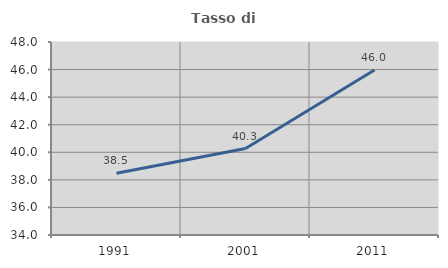
| Category | Tasso di occupazione   |
|---|---|
| 1991.0 | 38.482 |
| 2001.0 | 40.274 |
| 2011.0 | 45.974 |